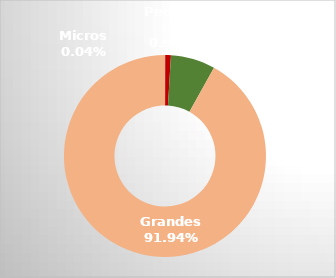
| Category | Series 0 |
|---|---|
| Micros | 0.039 |
| Pequeños | 0.903 |
| Medianos | 7.119 |
| Grandes | 91.939 |